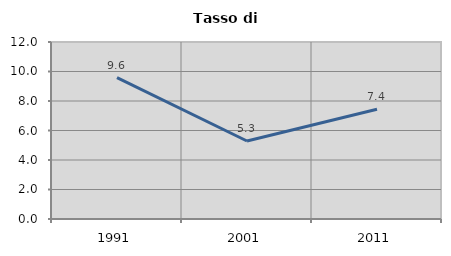
| Category | Tasso di disoccupazione   |
|---|---|
| 1991.0 | 9.581 |
| 2001.0 | 5.29 |
| 2011.0 | 7.444 |